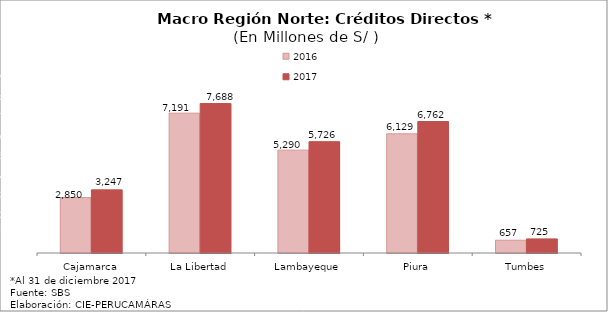
| Category | 2016 | 2017 |
|---|---|---|
| Cajamarca | 2849.705 | 3246.872 |
| La Libertad | 7191.214 | 7687.732 |
| Lambayeque | 5290.23 | 5726.122 |
| Piura | 6128.603 | 6761.876 |
| Tumbes | 656.551 | 724.694 |